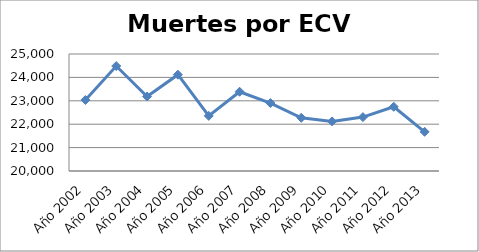
| Category | Series 0 |
|---|---|
| Año 2002 | 23034 |
| Año 2003 | 24485 |
| Año 2004 | 23184 |
| Año 2005 | 24116 |
| Año 2006 | 22356 |
| Año 2007 | 23387 |
| Año 2008 | 22904 |
| Año 2009 | 22275 |
| Año 2010 | 22120 |
| Año 2011 | 22304 |
| Año 2012 | 22745 |
| Año 2013 | 21674 |